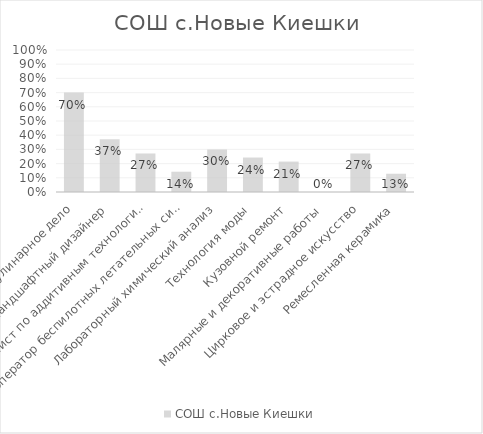
| Category | СОШ с.Новые Киешки |
|---|---|
| Кулинарное дело | 0.7 |
| Ландшафтный дизайнер | 0.371 |
| Специалист по аддитивным технологиям | 0.271 |
| Оператор беспилотных летательных систем | 0.143 |
| Лабораторный химический анализ | 0.3 |
| Технология моды | 0.243 |
| Кузовной ремонт | 0.214 |
| Малярные и декоративные работы | 0 |
| Цирковое и эстрадное искусство | 0.271 |
| Ремесленная керамика | 0.129 |